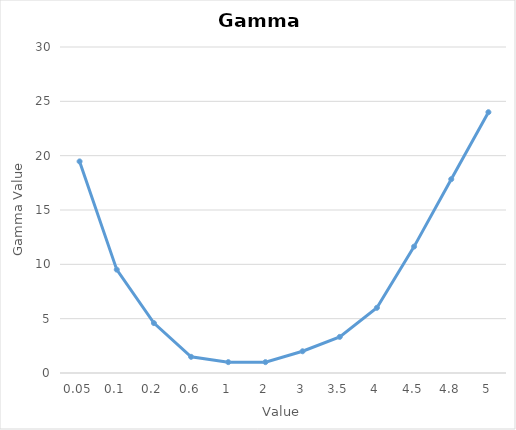
| Category | Gamma Value |
|---|---|
| 0.05 | 19.47 |
| 0.1 | 9.514 |
| 0.2 | 4.591 |
| 0.6 | 1.489 |
| 1.0 | 1 |
| 2.0 | 1 |
| 3.0 | 2 |
| 3.5 | 3.323 |
| 4.0 | 6 |
| 4.5 | 11.632 |
| 4.8 | 17.838 |
| 5.0 | 24 |